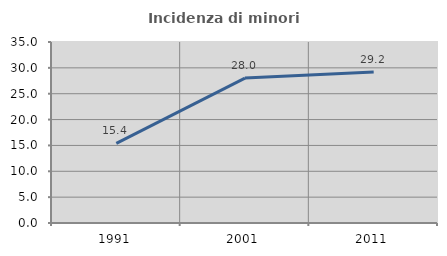
| Category | Incidenza di minori stranieri |
|---|---|
| 1991.0 | 15.385 |
| 2001.0 | 28.015 |
| 2011.0 | 29.191 |